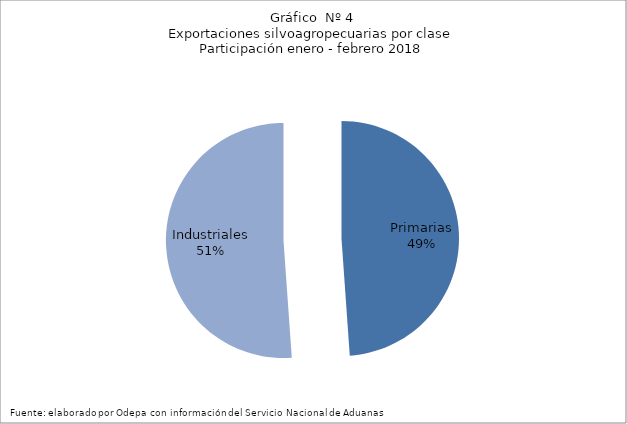
| Category | Series 0 |
|---|---|
| Primarias | 1626784 |
| Industriales | 1701530 |